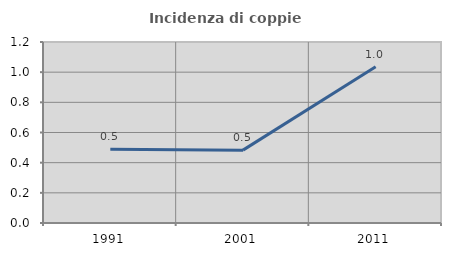
| Category | Incidenza di coppie miste |
|---|---|
| 1991.0 | 0.49 |
| 2001.0 | 0.483 |
| 2011.0 | 1.037 |